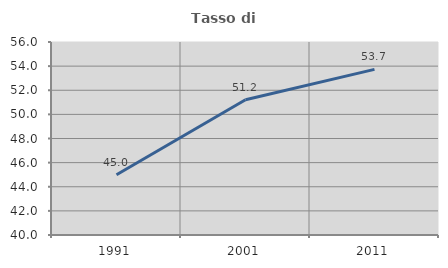
| Category | Tasso di occupazione   |
|---|---|
| 1991.0 | 44.989 |
| 2001.0 | 51.209 |
| 2011.0 | 53.732 |